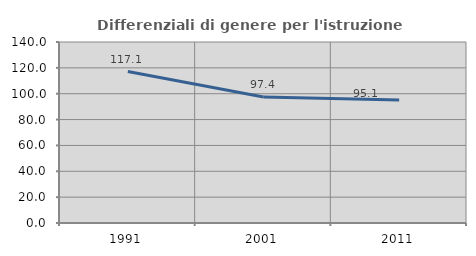
| Category | Differenziali di genere per l'istruzione superiore |
|---|---|
| 1991.0 | 117.139 |
| 2001.0 | 97.389 |
| 2011.0 | 95.099 |